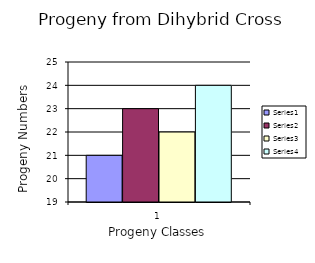
| Category | Series 0 | Series 1 | Series 2 | Series 3 |
|---|---|---|---|---|
| 0 | 21 | 23 | 22 | 24 |